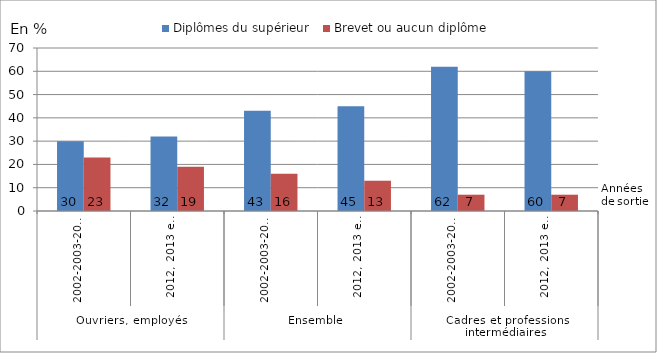
| Category | Diplômes du supérieur | Brevet ou aucun diplôme |
|---|---|---|
| 0 | 30 | 23 |
| 01/01/1900 | 32 | 19 |
| 02/01/1900 | 43 | 16 |
| 03/01/1900 | 45 | 13 |
| 04/01/1900 | 62 | 7 |
| 05/01/1900 | 60 | 7 |